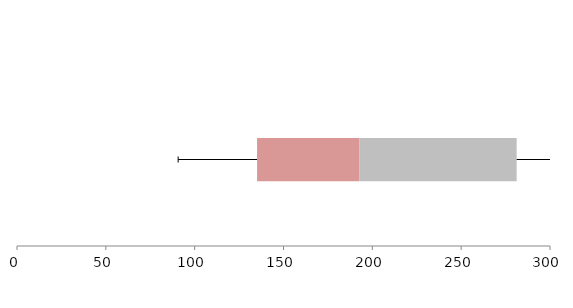
| Category | Series 1 | Series 2 | Series 3 |
|---|---|---|---|
| 0 | 135.124 | 57.641 | 88.466 |